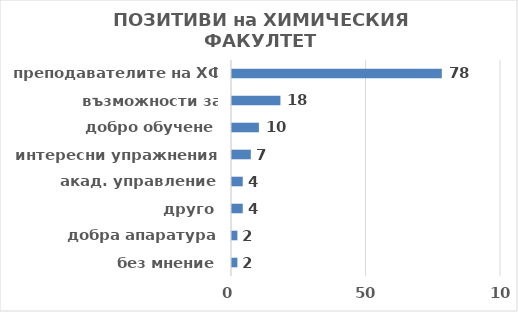
| Category | Series 0 |
|---|---|
| без мнение | 2 |
| добра апаратура | 2 |
| друго | 4 |
| акад. управление | 4 |
| интересни упражнения | 7 |
| добро обучене | 10 |
| възможности за развитие | 18 |
| преподавателите на ХФ | 78 |